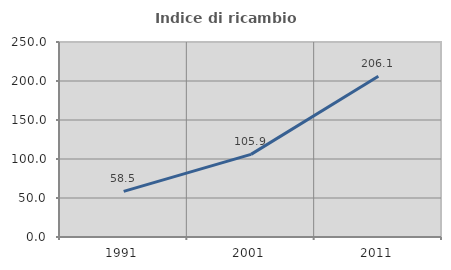
| Category | Indice di ricambio occupazionale  |
|---|---|
| 1991.0 | 58.511 |
| 2001.0 | 105.941 |
| 2011.0 | 206.122 |